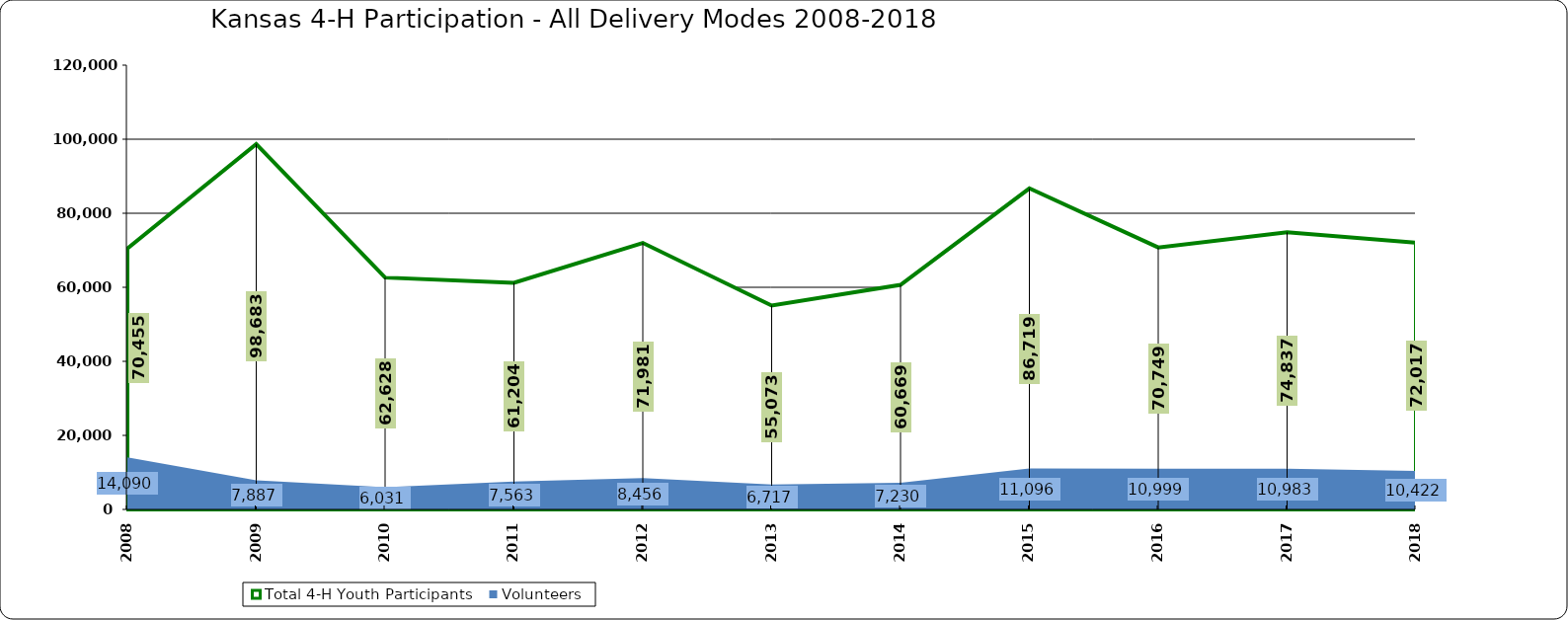
| Category | Total 4-H Youth Participants | Volunteers |
|---|---|---|
| 2008.0 | 70455 | 14090 |
| 2009.0 | 98683 | 7887 |
| 2010.0 | 62628 | 6031 |
| 2011.0 | 61204 | 7563 |
| 2012.0 | 71981 | 8456 |
| 2013.0 | 55073 | 6717 |
| 2014.0 | 60669 | 7230 |
| 2015.0 | 86719 | 11096 |
| 2016.0 | 70749 | 10999 |
| 2017.0 | 74837 | 10983 |
| 2018.0 | 72017 | 10422 |